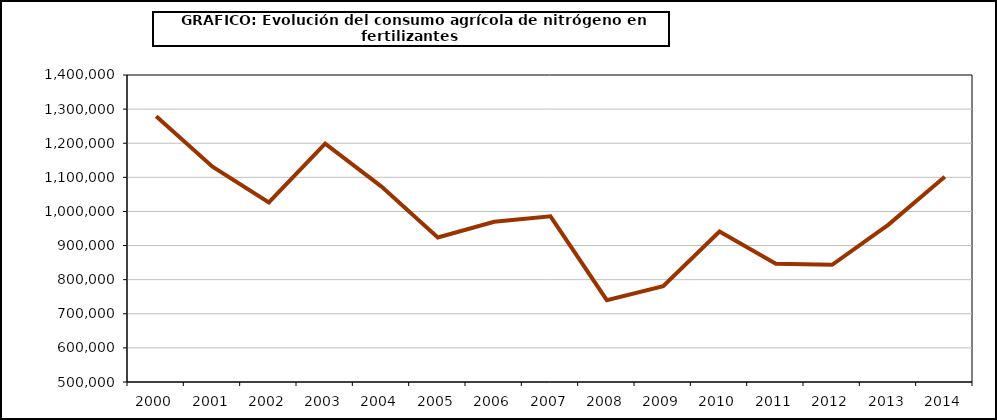
| Category | fertilizantes |
|---|---|
| 2000.0 | 1279154 |
| 2001.0 | 1131006 |
| 2002.0 | 1026546 |
| 2003.0 | 1198606 |
| 2004.0 | 1072949 |
| 2005.0 | 923764 |
| 2006.0 | 969783 |
| 2007.0 | 985857 |
| 2008.0 | 739757 |
| 2009.0 | 781069 |
| 2010.0 | 940984 |
| 2011.0 | 846697 |
| 2012.0 | 843410 |
| 2013.0 | 961507 |
| 2014.0 | 1101895 |